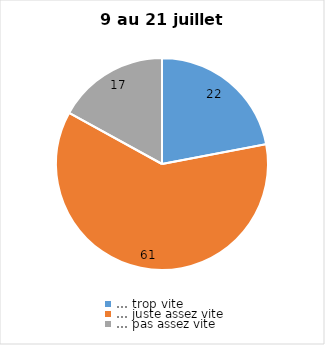
| Category | Series 0 |
|---|---|
| … trop vite | 22 |
| … juste assez vite | 61 |
| … pas assez vite | 17 |